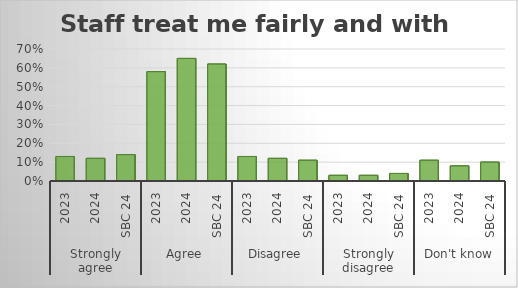
| Category | Staff treat me fairly and with respect. |
|---|---|
| 0 | 0.13 |
| 1 | 0.12 |
| 2 | 0.14 |
| 3 | 0.58 |
| 4 | 0.65 |
| 5 | 0.62 |
| 6 | 0.13 |
| 7 | 0.12 |
| 8 | 0.11 |
| 9 | 0.03 |
| 10 | 0.03 |
| 11 | 0.04 |
| 12 | 0.11 |
| 13 | 0.08 |
| 14 | 0.1 |